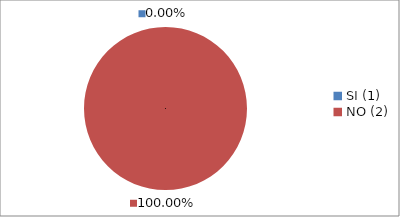
| Category | Series 0 |
|---|---|
| SI (1) | 0 |
| NO (2) | 1 |